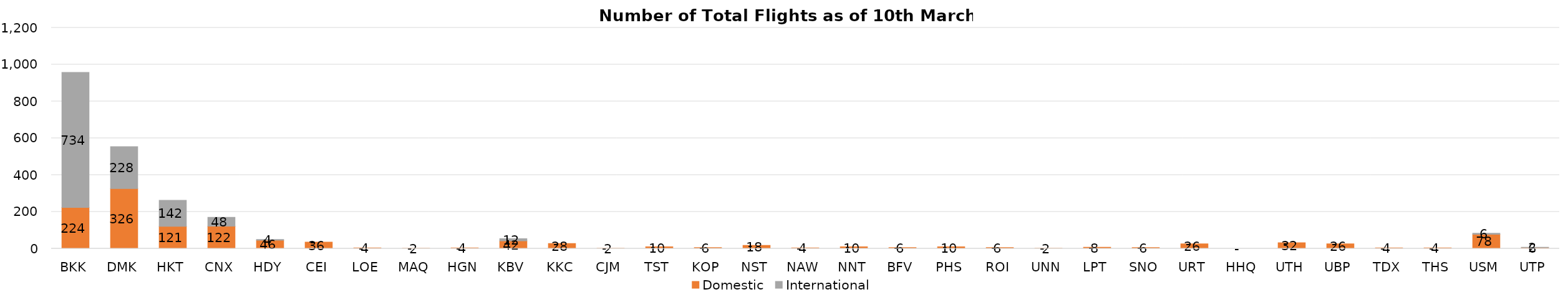
| Category | Domestic | International |
|---|---|---|
| BKK | 224 | 734 |
| DMK | 326 | 228 |
| HKT | 121 | 142 |
| CNX | 122 | 48 |
| HDY | 46 | 4 |
| CEI | 36 | 0 |
| LOE | 4 | 0 |
| MAQ | 2 | 0 |
| HGN | 4 | 0 |
| KBV | 42 | 12 |
| KKC | 28 | 0 |
| CJM | 2 | 0 |
| TST | 10 | 0 |
| KOP | 6 | 0 |
| NST | 18 | 0 |
| NAW | 4 | 0 |
| NNT | 10 | 0 |
| BFV | 6 | 0 |
| PHS | 10 | 0 |
| ROI | 6 | 0 |
| UNN | 2 | 0 |
| LPT | 8 | 0 |
| SNO | 6 | 0 |
| URT | 26 | 0 |
| HHQ | 0 | 0 |
| UTH | 32 | 0 |
| UBP | 26 | 0 |
| TDX | 4 | 0 |
| THS | 4 | 0 |
| USM | 78 | 6 |
| UTP | 6 | 2 |